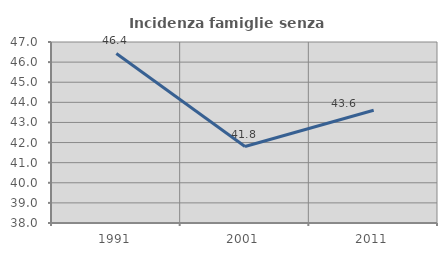
| Category | Incidenza famiglie senza nuclei |
|---|---|
| 1991.0 | 46.429 |
| 2001.0 | 41.803 |
| 2011.0 | 43.609 |